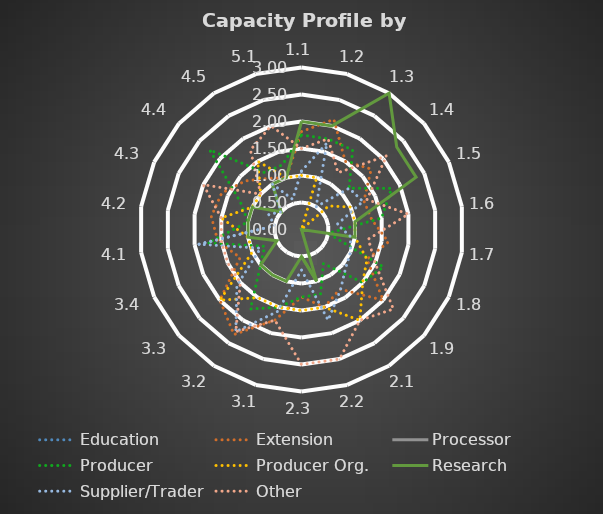
| Category | Education | Extension | Processor | Producer | Producer Org. | Research | Supplier/Trader | Other |
|---|---|---|---|---|---|---|---|---|
| 1.1 | 0 | 1.812 | 0 | 1.75 | 1 | 2 | 1.083 | 1.5 |
| 1.2 | 0 | 2.125 | 0 | 1.75 | 1 | 2 | 1.667 | 1.75 |
| 1.3 | 0 | 1.5 | 0 | 1.75 | 0 | 3 | 0.5 | 1.25 |
| 1.4 | 0 | 1.708 | 0 | 1.167 | 0.667 | 2.333 | 1.167 | 2.083 |
| 1.5 | 0 | 1.271 | 0 | 1.833 | 1 | 2.333 | 1.25 | 1.333 |
| 1.6 | 0 | 1.312 | 0 | 1.5 | 1 | 1 | 0.667 | 2 |
| 1.7 | 0 | 1.625 | 0 | 0.5 | 1 | 1 | 0.917 | 1.25 |
| 1.8 | 0 | 1.333 | 0 | 1.667 | 1.333 | 0 | 1 | 1.5 |
| 1.9 | 0 | 2 | 0 | 1.5 | 1.5 | 0 | 1.083 | 2.25 |
| 2.1 | 0 | 1.312 | 0 | 0.75 | 2 | 0 | 1.333 | 2 |
| 2.2 | 0 | 1.5 | 0 | 1.25 | 1.5 | 1 | 1.75 | 2.5 |
| 2.3 | 0 | 1.25 | 0 | 1.25 | 1.5 | 0.5 | 0.75 | 2.5 |
| 3.1 | 0 | 1.75 | 0 | 1.5 | 1.5 | 1 | 1.583 | 1.75 |
| 3.2 | 0 | 2.312 | 0 | 1.75 | 1.5 | 1 | 2.25 | 2.25 |
| 3.3 | 0 | 2 | 0 | 1 | 2 | 1 | 1.583 | 1.5 |
| 3.4 | 0 | 1.25 | 0 | 0.75 | 1 | 0.5 | 0.833 | 1.5 |
| 4.1 | 0 | 1.562 | 0 | 1.75 | 1 | 1 | 1.917 | 1.5 |
| 4.2 | 0 | 1.688 | 0 | 1 | 1.5 | 1 | 0.5 | 1.5 |
| 4.3 | 0 | 1.625 | 0 | 1.25 | 1 | 1 | 0.667 | 2 |
| 4.4 | 0 | 1.375 | 0 | 2.25 | 1 | 0.5 | 0.5 | 1 |
| 4.5 | 0 | 1.125 | 0 | 1.25 | 1.5 | 1 | 1 | 1.75 |
| 5.1 | 0 | 1 | 0 | 1.25 | 1 | 1 | 0.583 | 2 |